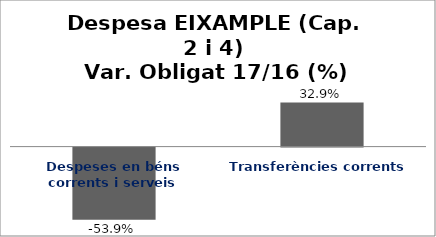
| Category | Series 0 |
|---|---|
| Despeses en béns corrents i serveis | -0.539 |
| Transferències corrents | 0.329 |